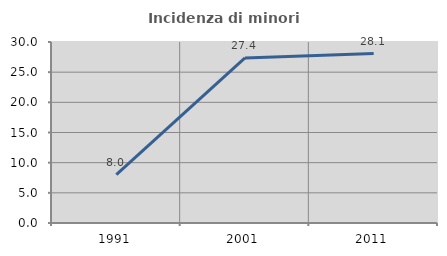
| Category | Incidenza di minori stranieri |
|---|---|
| 1991.0 | 8 |
| 2001.0 | 27.363 |
| 2011.0 | 28.088 |